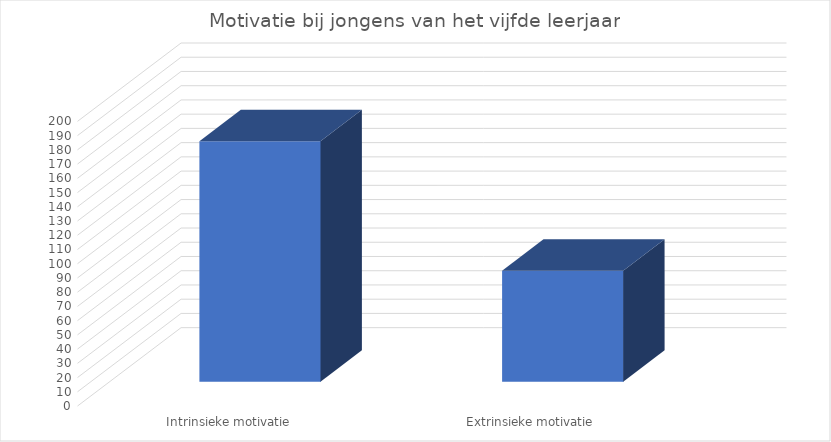
| Category | Series 0 |
|---|---|
| Intrinsieke motivatie | 169 |
| Extrinsieke motivatie | 78 |